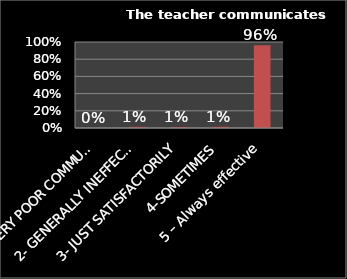
| Category | Series 0 |
|---|---|
| 1- VERY POOR COMMUNICATION | 0 |
| 2- GENERALLY INEFFECTIVE | 0.013 |
| 3- JUST SATISFACTORILY | 0.011 |
| 4-SOMETIMES | 0.014 |
| 5 – Always effective | 0.962 |